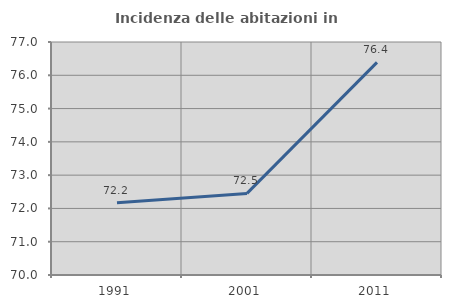
| Category | Incidenza delle abitazioni in proprietà  |
|---|---|
| 1991.0 | 72.169 |
| 2001.0 | 72.451 |
| 2011.0 | 76.389 |